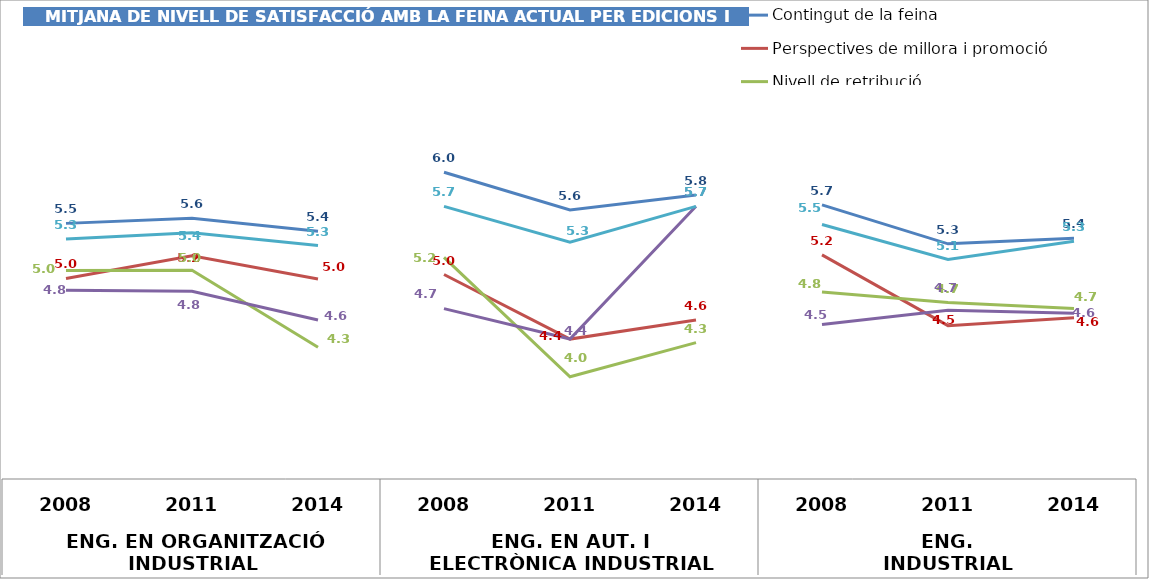
| Category | Contingut de la feina | Perspectives de millora i promoció | Nivell de retribució | Utilitat dels coneixements de la formació universitària | Satisfacció general amb la feina * |
|---|---|---|---|---|---|
| 0 | 5.5 | 4.962 | 5.038 | 4.846 | 5.346 |
| 1 | 5.551 | 5.184 | 5.041 | 4.837 | 5.408 |
| 2 | 5.422 | 4.956 | 4.289 | 4.556 | 5.283 |
| 3 | 6 | 5 | 5.167 | 4.667 | 5.667 |
| 4 | 5.632 | 4.368 | 4 | 4.368 | 5.316 |
| 5 | 5.778 | 4.556 | 4.333 | 5.667 | 5.667 |
| 6 | 5.681 | 5.191 | 4.83 | 4.511 | 5.489 |
| 7 | 5.3 | 4.5 | 4.725 | 4.65 | 5.146 |
| 8 | 5.356 | 4.578 | 4.667 | 4.622 | 5.326 |